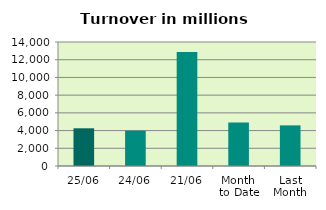
| Category | Series 0 |
|---|---|
| 25/06 | 4256.417 |
| 24/06 | 3990.88 |
| 21/06 | 12871.403 |
| Month 
to Date | 4910.056 |
| Last
Month | 4586.899 |